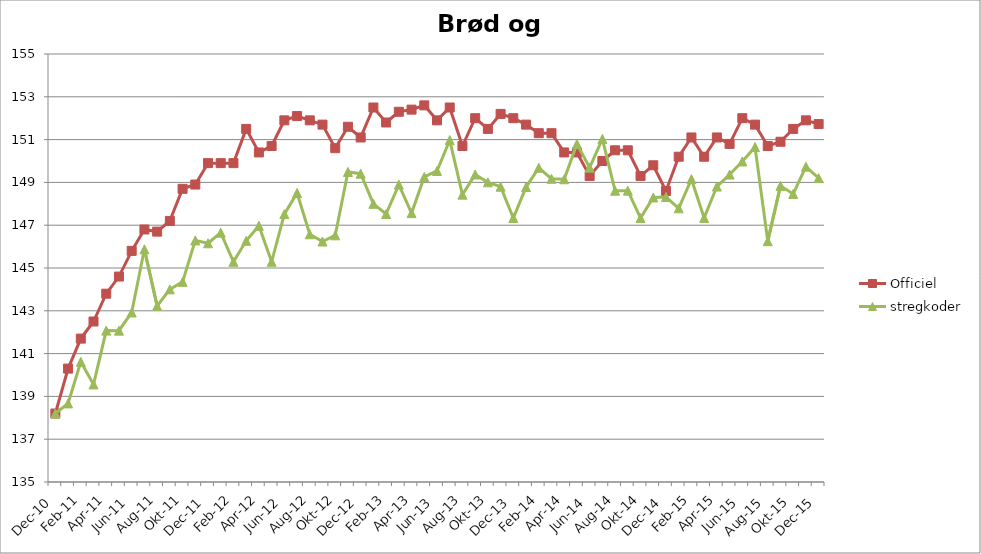
| Category | Officiel | stregkoder |
|---|---|---|
|  Dec-10 | 138.2 | 138.202 |
|  Jan-11 | 140.3 | 138.674 |
|  Feb-11 | 141.7 | 140.615 |
|  Mar-11 | 142.5 | 139.56 |
|  Apr-11 | 143.8 | 142.075 |
|  Maj-11 | 144.6 | 142.073 |
|  Jun-11 | 145.8 | 142.924 |
|  Jul-11 | 146.8 | 145.873 |
|  Aug-11 | 146.7 | 143.224 |
|  Sep-11 | 147.2 | 144.003 |
|  Okt-11 | 148.7 | 144.354 |
|  Nov-11 | 148.9 | 146.289 |
|  Dec-11 | 149.9 | 146.156 |
|  Jan-12 | 149.9 | 146.651 |
|  Feb-12 | 149.9 | 145.289 |
|  Mar-12 | 151.5 | 146.271 |
|  Apr-12 | 150.4 | 146.973 |
|  Maj-12 | 150.7 | 145.291 |
|  Jun-12 | 151.9 | 147.518 |
|  Jul-12 | 152.1 | 148.505 |
|  Aug-12 | 151.9 | 146.577 |
|  Sep-12 | 151.7 | 146.237 |
|  Okt-12 | 150.6 | 146.526 |
|  Nov-12 | 151.6 | 149.488 |
|  Dec-12 | 151.1 | 149.408 |
|  Jan-13 | 152.5 | 147.999 |
|  Feb-13 | 151.8 | 147.525 |
|  Mar-13 | 152.3 | 148.896 |
|  Apr-13 | 152.4 | 147.566 |
|  Maj-13 | 152.6 | 149.255 |
|  Jun-13 | 151.9 | 149.534 |
|  Jul-13 | 152.5 | 150.975 |
|  Aug-13 | 150.7 | 148.428 |
|  Sep-13 | 152 | 149.369 |
|  Okt-13 | 151.5 | 149.004 |
|  Nov-13 | 152.2 | 148.799 |
|  Dec-13 | 152 | 147.335 |
|  Jan-14 | 151.7 | 148.782 |
|  Feb-14 | 151.3 | 149.684 |
|  Mar-14 | 151.3 | 149.169 |
|  Apr-14 | 150.4 | 149.147 |
|  Maj-14 | 150.4 | 150.796 |
|  Jun-14 | 149.3 | 149.689 |
|  Jul-14 | 150 | 151.031 |
|  Aug-14 | 150.5 | 148.61 |
|  Sep-14 | 150.5 | 148.612 |
|  Okt-14 | 149.3 | 147.333 |
|  Nov-14 | 149.8 | 148.296 |
|  Dec-14 | 148.6 | 148.316 |
|  Jan-15 | 150.2 | 147.789 |
|  Feb-15 | 151.1 | 149.151 |
|  Mar-15 | 150.2 | 147.339 |
|  Apr-15 | 151.1 | 148.806 |
|  Maj-15 | 150.8 | 149.367 |
| Jun-15 | 152 | 149.978 |
| Jul-15 | 151.7 | 150.653 |
| Aug-15 | 150.7 | 146.254 |
| Sep-15 | 150.9 | 148.839 |
| Okt-15 | 151.5 | 148.463 |
| Nov-15 | 151.9 | 149.733 |
| Dec-15 | 151.727 | 149.202 |